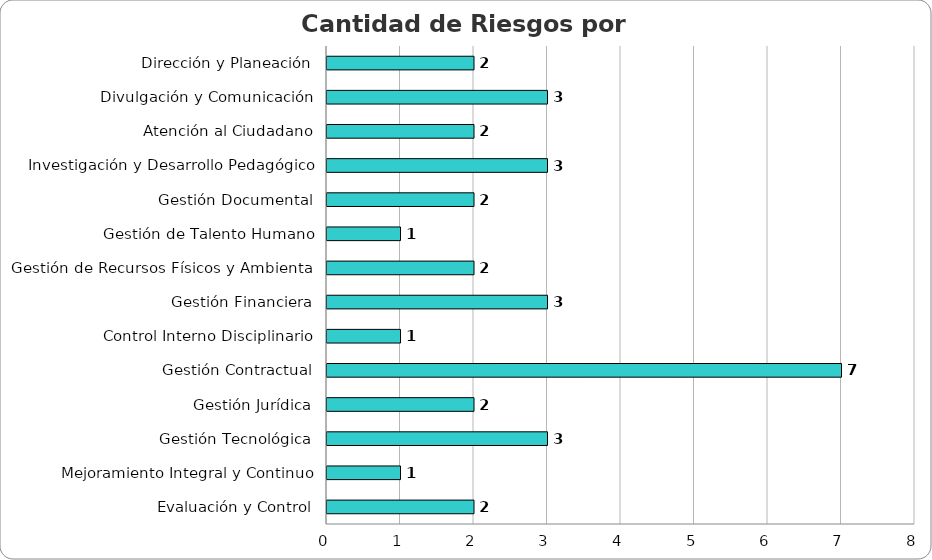
| Category | Series 0 |
|---|---|
| Dirección y Planeación | 2 |
| Divulgación y Comunicación | 3 |
| Atención al Ciudadano | 2 |
| Investigación y Desarrollo Pedagógico | 3 |
| Gestión Documental | 2 |
| Gestión de Talento Humano | 1 |
| Gestión de Recursos Físicos y Ambiental | 2 |
| Gestión Financiera | 3 |
| Control Interno Disciplinario | 1 |
| Gestión Contractual | 7 |
| Gestión Jurídica | 2 |
| Gestión Tecnológica | 3 |
| Mejoramiento Integral y Continuo | 1 |
| Evaluación y Control | 2 |